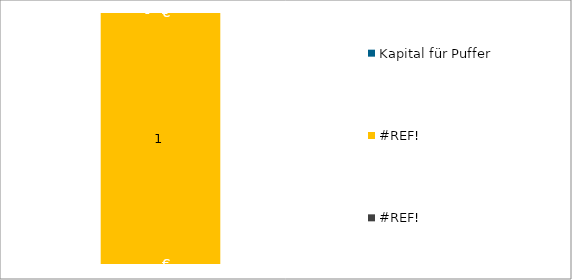
| Category | #REF! | Kapital für Puffer |
|---|---|---|
| 0 | 1 | 0 |